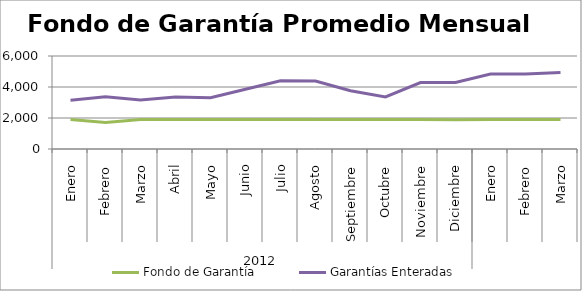
| Category | Fondo de Garantía | Garantías Enteradas |
|---|---|---|
| 0 | 1896.798 | 3141.641 |
| 1 | 1714.423 | 3362.648 |
| 2 | 1900.513 | 3154.118 |
| 3 | 1900.513 | 3348.058 |
| 4 | 1898.685 | 3308.859 |
| 5 | 1900.513 | 3850.375 |
| 6 | 1900.513 | 4400.539 |
| 7 | 1895.388 | 4383.327 |
| 8 | 1900.513 | 3757.632 |
| 9 | 1900.513 | 3362.932 |
| 10 | 1900.311 | 4285.609 |
| 11 | 1890.98 | 4296.87 |
| 12 | 1898.667 | 4842.786 |
| 13 | 1900.512 | 4845.136 |
| 14 | 1900.513 | 4938.365 |